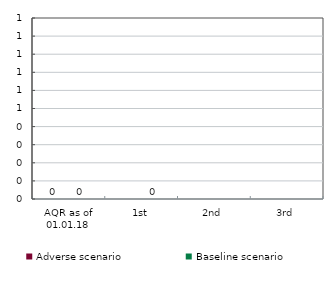
| Category | Adverse scenario | Baseline scenario |
|---|---|---|
| AQR as of 01.01.18 | 0 | 0 |
| 1st | 0 | 0 |
| 2nd | 0 | 0 |
| 3rd | 0 | 0 |